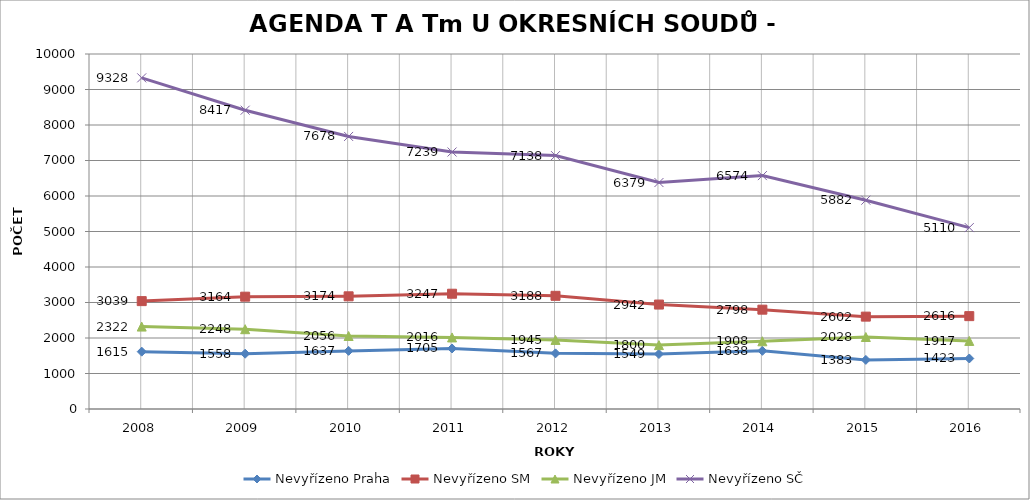
| Category | Nevyřízeno Praha | Nevyřízeno SM | Nevyřízeno JM | Nevyřízeno SČ |
|---|---|---|---|---|
| 2008.0 | 1615 | 3039 | 2322 | 9328 |
| 2009.0 | 1558 | 3164 | 2248 | 8417 |
| 2010.0 | 1637 | 3174 | 2056 | 7678 |
| 2011.0 | 1705 | 3247 | 2016 | 7239 |
| 2012.0 | 1567 | 3188 | 1945 | 7138 |
| 2013.0 | 1549 | 2942 | 1800 | 6379 |
| 2014.0 | 1638 | 2798 | 1908 | 6574 |
| 2015.0 | 1383 | 2602 | 2028 | 5882 |
| 2016.0 | 1423 | 2616 | 1917 | 5110 |